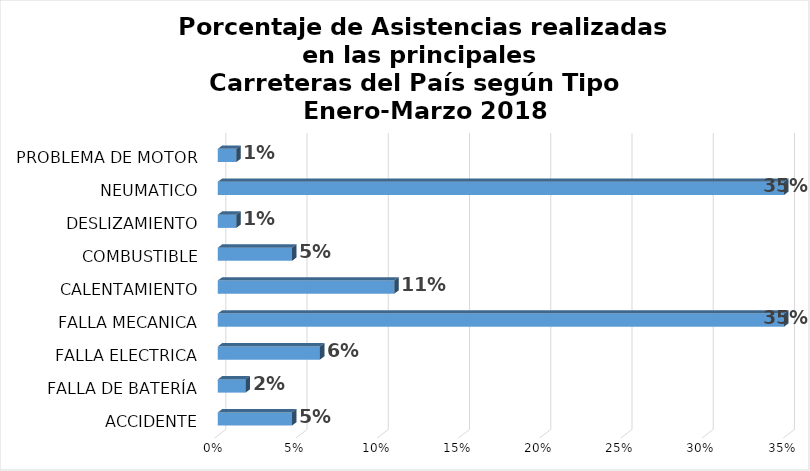
| Category | Series 0 |
|---|---|
| ACCIDENTE | 0.046 |
| FALLA DE BATERÍA | 0.017 |
| FALLA ELECTRICA | 0.063 |
| FALLA MECANICA | 0.349 |
| CALENTAMIENTO | 0.109 |
| COMBUSTIBLE | 0.046 |
| DESLIZAMIENTO | 0.011 |
| NEUMATICO | 0.349 |
| PROBLEMA DE MOTOR | 0.011 |